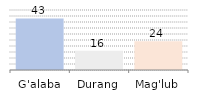
| Category | Series 0 |
|---|---|
| G'alaba | 43 |
| Durang | 16 |
| Mag'lub | 24 |